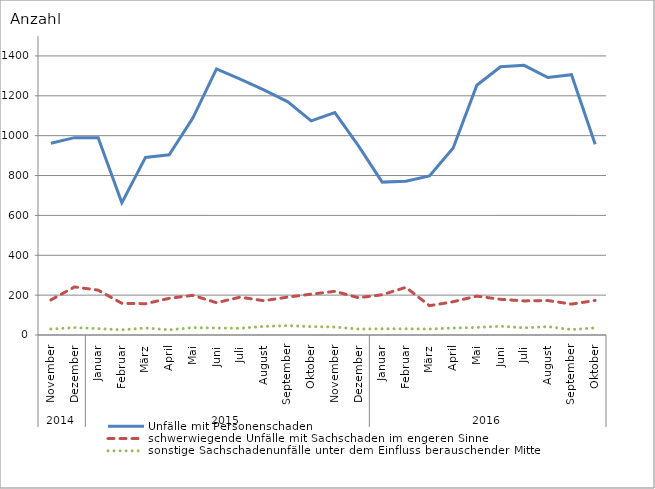
| Category | Unfälle mit Personenschaden | schwerwiegende Unfälle mit Sachschaden im engeren Sinne | sonstige Sachschadenunfälle unter dem Einfluss berauschender Mittel |
|---|---|---|---|
| 0 | 962 | 176 | 30 |
| 1 | 990 | 241 | 37 |
| 2 | 990 | 225 | 32 |
| 3 | 663 | 159 | 26 |
| 4 | 891 | 157 | 35 |
| 5 | 904 | 184 | 26 |
| 6 | 1088 | 199 | 37 |
| 7 | 1335 | 162 | 35 |
| 8 | 1284 | 190 | 34 |
| 9 | 1230 | 172 | 43 |
| 10 | 1171 | 190 | 47 |
| 11 | 1074 | 205 | 42 |
| 12 | 1116 | 219 | 40 |
| 13 | 949 | 187 | 30 |
| 14 | 767 | 202 | 31 |
| 15 | 771 | 239 | 31 |
| 16 | 798 | 147 | 30 |
| 17 | 938 | 167 | 35 |
| 18 | 1253 | 195 | 38 |
| 19 | 1346 | 179 | 44 |
| 20 | 1353 | 171 | 36 |
| 21 | 1292 | 173 | 42 |
| 22 | 1306 | 155 | 27 |
| 23 | 957 | 173 | 36 |